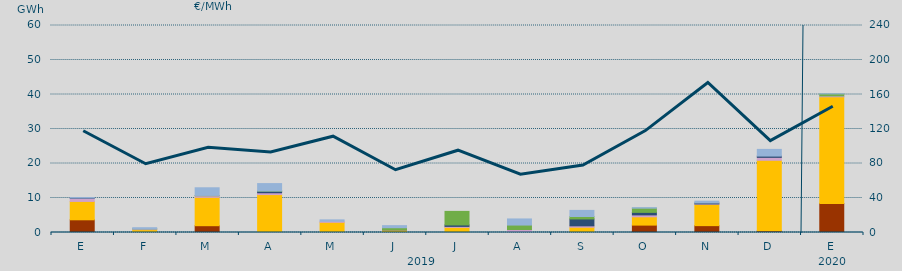
| Category | Carbón | Ciclo Combinado | Consumo Bombeo | Enlace Península Baleares | Eólica | Hidráulica | Turbinación bombeo |
|---|---|---|---|---|---|---|---|
| E | 3682 | 5322.9 | 938.4 | 84 | 0 | 0 | 101.3 |
| F | 0 | 833.4 | 213.9 | 0 | 0 | 20 | 316.9 |
| M | 1971 | 8220.1 | 457 | 0 | 0 | 93.4 | 2222.8 |
| A | 0 | 10989.2 | 526.4 | 464.9 | 0 | 36.7 | 2160.3 |
| M | 0 | 2953.6 | 298.3 | 0 | 0 | 0 | 406.3 |
| J | 0 | 740 | 46.8 | 0.2 | 0 | 591.6 | 608.6 |
| J | 0 | 1487.2 | 278 | 427 | 0 | 3925.5 | 0 |
| A | 0 | 3 | 860.8 | 0 | 0 | 1293.4 | 1772.4 |
| S | 0 | 1521.8 | 407.7 | 1996.9 | 0 | 704.6 | 1776.1 |
| O | 2142 | 2403.7 | 557.8 | 729 | 0 | 1220 | 154.4 |
| N | 1990 | 6178.7 | 123 | 256 | 0 | 0 | 528.8 |
| D | 480 | 20442.6 | 860.7 | 364.9 | 0 | 0 | 1941.3 |
| E | 8420 | 30910.7 | 268 | 0 | 0 | 577.4 | 42.2 |